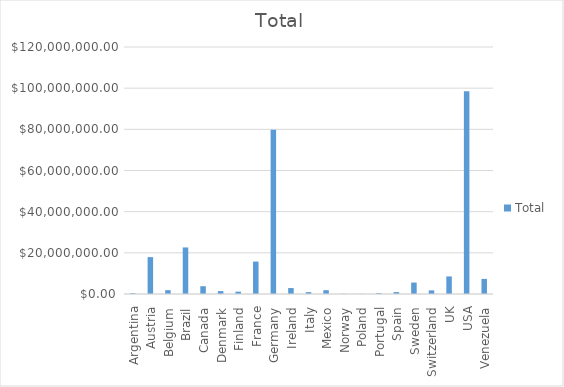
| Category | Total |
|---|---|
| Argentina | 366391.2 |
| Austria | 17929231.65 |
| Belgium | 1868036.16 |
| Brazil | 22613746.08 |
| Canada | 3784480 |
| Denmark | 1418320.8 |
| Finland | 1145004.15 |
| France | 15747602.84 |
| Germany | 79737043.32 |
| Ireland | 2896244.24 |
| Italy | 914105.1 |
| Mexico | 1864454.5 |
| Norway | 102024.09 |
| Poland | 67670.5 |
| Portugal | 394894.37 |
| Spain | 931439.86 |
| Sweden | 5557305.15 |
| Switzerland | 1762650.45 |
| UK | 8546457.54 |
| USA | 98526819.4 |
| Venezuela | 7332387.56 |